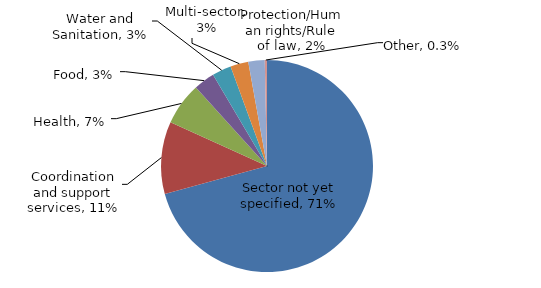
| Category | Series 0 |
|---|---|
| Sector not yet specified | 0.707 |
| Coordination and support services | 0.111 |
| Health | 0.065 |
| Food | 0.032 |
| Water and Sanitation | 0.029 |
| Multi-sector | 0.027 |
| Protection/Human rights/Rule of law | 0.025 |
| Other | 0.003 |